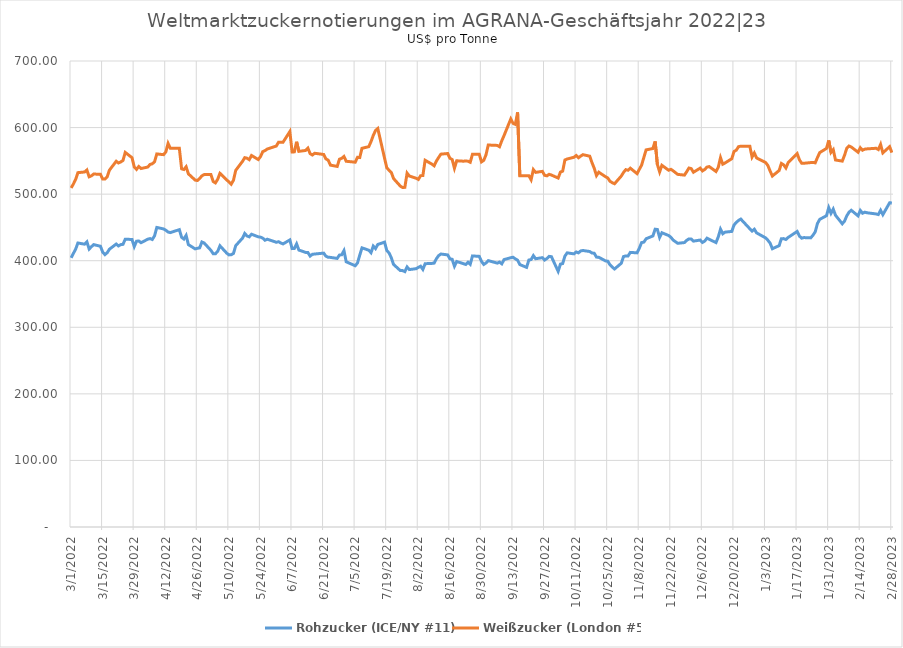
| Category |  Rohzucker (ICE/NY #11)  |  Weißzucker (London #5)  |
|---|---|---|
| 3/1/22 | 404.328 | 509.3 |
| 3/2/22 | 410.942 | 515.2 |
| 3/3/22 | 417.335 | 522.2 |
| 3/4/22 | 426.595 | 532.3 |
| 3/7/22 | 424.831 | 533.3 |
| 3/8/22 | 428.358 | 536.3 |
| 3/9/22 | 417.556 | 526.1 |
| 3/10/22 | 421.083 | 527.5 |
| 3/11/22 | 424.17 | 530.2 |
| 3/14/22 | 421.745 | 529.8 |
| 3/15/22 | 412.926 | 522.7 |
| 3/16/22 | 409.178 | 522.6 |
| 3/17/22 | 412.044 | 526 |
| 3/18/22 | 417.335 | 536.1 |
| 3/21/22 | 425.052 | 549.4 |
| 3/22/22 | 422.186 | 546.8 |
| 3/23/22 | 424.17 | 548.4 |
| 3/24/22 | 424.611 | 550.6 |
| 3/25/22 | 432.327 | 562.7 |
| 3/28/22 | 431.886 | 554.8 |
| 3/29/22 | 421.304 | 540.8 |
| 3/30/22 | 429.24 | 537.2 |
| 3/31/22 | 429.681 | 541.5 |
| 4/1/22 | 427.036 | 538.5 |
| 4/4/22 | 432.327 | 540.7 |
| 4/5/22 | 433.209 | 544.6 |
| 4/6/22 | 431.886 | 545.6 |
| 4/7/22 | 437.397 | 548.7 |
| 4/8/22 | 449.964 | 560.4 |
| 4/11/22 | 447.759 | 559.3 |
| 4/12/22 | 445.775 | 563.4 |
| 4/13/22 | 443.129 | 576.2 |
| 4/14/22 | 442.248 | 568.8 |
| 4/18/22 | 446.657 | 568.8 |
| 4/19/22 | 435.193 | 538 |
| 4/20/22 | 432.547 | 537 |
| 4/21/22 | 438.059 | 541.1 |
| 4/22/22 | 424.17 | 530.5 |
| 4/25/22 | 417.776 | 521.1 |
| 4/26/22 | 418.658 | 520.5 |
| 4/27/22 | 419.319 | 523.5 |
| 4/28/22 | 428.138 | 527.5 |
| 4/29/22 | 426.595 | 529.4 |
| 5/2/22 | 415.572 | 529.4 |
| 5/3/22 | 410.501 | 519 |
| 5/4/22 | 410.501 | 516.9 |
| 5/5/22 | 414.028 | 522.3 |
| 5/6/22 | 422.406 | 531.3 |
| 5/9/22 | 411.383 | 521.4 |
| 5/10/22 | 408.737 | 518.3 |
| 5/11/22 | 408.958 | 515 |
| 5/12/22 | 410.942 | 520.9 |
| 5/13/22 | 422.626 | 535.7 |
| 5/16/22 | 433.87 | 549.2 |
| 5/17/22 | 440.925 | 554.8 |
| 5/18/22 | 437.177 | 554 |
| 5/19/22 | 435.854 | 551.8 |
| 5/20/22 | 439.822 | 558.1 |
| 5/23/22 | 435.854 | 552 |
| 5/24/22 | 435.413 | 556.5 |
| 5/25/22 | 433.87 | 563.9 |
| 5/26/22 | 430.784 | 565.4 |
| 5/27/22 | 432.327 | 567.8 |
| 5/31/22 | 427.697 | 572.3 |
| 6/1/22 | 428.579 | 578.1 |
| 6/2/22 | 426.595 | 578.1 |
| 6/3/22 | 425.272 | 578.1 |
| 6/6/22 | 431.224 | 594 |
| 6/7/22 | 418.217 | 563.4 |
| 6/8/22 | 418.438 | 563.5 |
| 6/9/22 | 425.272 | 578.7 |
| 6/10/22 | 416.013 | 564.3 |
| 6/13/22 | 412.485 | 565.6 |
| 6/14/22 | 412.265 | 569.1 |
| 6/15/22 | 406.974 | 560.8 |
| 6/16/22 | 409.619 | 558.8 |
| 6/17/22 | 410.06 | 561.4 |
| 6/21/22 | 411.383 | 559.6 |
| 6/22/22 | 406.753 | 553 |
| 6/23/22 | 405.21 | 551 |
| 6/24/22 | 404.989 | 543.6 |
| 6/27/22 | 403.446 | 541.6 |
| 6/28/22 | 408.517 | 552.5 |
| 6/29/22 | 408.958 | 553.8 |
| 6/30/22 | 415.131 | 556.6 |
| 7/1/22 | 398.376 | 549.4 |
| 7/5/22 | 392.423 | 548 |
| 7/6/22 | 396.612 | 555.3 |
| 7/7/22 | 408.296 | 555 |
| 7/8/22 | 419.319 | 568.9 |
| 7/11/22 | 415.792 | 571.3 |
| 7/12/22 | 412.044 | 578.9 |
| 7/13/22 | 421.965 | 588.2 |
| 7/14/22 | 418.217 | 595.6 |
| 7/15/22 | 424.39 | 598.6 |
| 7/18/22 | 427.918 | 554.1 |
| 7/19/22 | 415.351 | 539.6 |
| 7/20/22 | 411.603 | 535.9 |
| 7/21/22 | 404.549 | 532.6 |
| 7/22/22 | 394.407 | 523.4 |
| 7/25/22 | 385.148 | 512.1 |
| 7/26/22 | 385.148 | 510 |
| 7/27/22 | 383.605 | 510.2 |
| 7/28/22 | 390.659 | 531.6 |
| 7/29/22 | 386.691 | 527.2 |
| 8/1/22 | 388.014 | 523.9 |
| 8/2/22 | 389.998 | 522.1 |
| 8/3/22 | 391.762 | 527.7 |
| 8/4/22 | 386.912 | 528 |
| 8/5/22 | 395.51 | 550.9 |
| 8/8/22 | 395.95 | 545.1 |
| 8/9/22 | 396.391 | 542.6 |
| 8/10/22 | 403.005 | 549.7 |
| 8/11/22 | 407.635 | 555.1 |
| 8/12/22 | 410.06 | 560.1 |
| 8/15/22 | 408.737 | 561 |
| 8/16/22 | 402.785 | 553.9 |
| 8/17/22 | 402.123 | 552 |
| 8/18/22 | 391.762 | 538.9 |
| 8/19/22 | 398.816 | 550.1 |
| 8/22/22 | 395.51 | 549.5 |
| 8/23/22 | 394.407 | 549.8 |
| 8/24/22 | 397.714 | 549.5 |
| 8/25/22 | 394.628 | 547.9 |
| 8/26/22 | 407.194 | 559.9 |
| 8/29/22 | 406.533 | 559.9 |
| 8/30/22 | 399.037 | 548.5 |
| 8/31/22 | 394.407 | 550.8 |
| 9/1/22 | 396.612 | 559.1 |
| 9/2/22 | 400.139 | 573.8 |
| 9/6/22 | 396.391 | 573.2 |
| 9/7/22 | 397.935 | 571.2 |
| 9/8/22 | 395.289 | 580.2 |
| 9/9/22 | 401.682 | 588 |
| 9/12/22 | 404.549 | 613 |
| 9/13/22 | 405.21 | 606.3 |
| 9/14/22 | 402.785 | 604.8 |
| 9/15/22 | 400.801 | 622.8 |
| 9/16/22 | 394.187 | 527.8 |
| 9/19/22 | 389.998 | 527.8 |
| 9/20/22 | 401.021 | 527.7 |
| 9/21/22 | 401.682 | 521.6 |
| 9/22/22 | 407.635 | 536.9 |
| 9/23/22 | 403.005 | 532.7 |
| 9/26/22 | 404.549 | 534.2 |
| 9/27/22 | 401.021 | 528.3 |
| 9/28/22 | 403.226 | 527.5 |
| 9/29/22 | 406.533 | 529.8 |
| 9/30/22 | 406.092 | 528.7 |
| 10/3/22 | 384.046 | 524.2 |
| 10/4/22 | 394.848 | 533.1 |
| 10/5/22 | 395.73 | 534.6 |
| 10/6/22 | 406.974 | 551.3 |
| 10/7/22 | 411.824 | 552.8 |
| 10/10/22 | 410.281 | 555.4 |
| 10/11/22 | 413.147 | 558 |
| 10/12/22 | 411.824 | 554.6 |
| 10/13/22 | 414.69 | 557.2 |
| 10/14/22 | 415.351 | 559.3 |
| 10/17/22 | 413.808 | 557 |
| 10/18/22 | 411.603 | 547.3 |
| 10/19/22 | 411.162 | 538.8 |
| 10/20/22 | 405.43 | 527.9 |
| 10/21/22 | 405.21 | 533 |
| 10/24/22 | 399.698 | 526.2 |
| 10/25/22 | 399.257 | 524.3 |
| 10/26/22 | 393.746 | 519.3 |
| 10/27/22 | 390.439 | 517.2 |
| 10/28/22 | 387.573 | 515.6 |
| 10/31/22 | 396.171 | 527.2 |
| 11/1/22 | 406.312 | 532.7 |
| 11/2/22 | 407.194 | 536.8 |
| 11/3/22 | 407.194 | 535.9 |
| 11/4/22 | 412.485 | 539 |
| 11/7/22 | 411.824 | 530.8 |
| 11/8/22 | 418.879 | 537.3 |
| 11/9/22 | 427.256 | 543.5 |
| 11/10/22 | 427.918 | 555.1 |
| 11/11/22 | 432.988 | 566.5 |
| 11/14/22 | 437.177 | 568.5 |
| 11/15/22 | 447.318 | 579.2 |
| 11/16/22 | 446.877 | 544.6 |
| 11/17/22 | 434.972 | 533.4 |
| 11/18/22 | 442.027 | 543.3 |
| 11/21/22 | 437.838 | 535.9 |
| 11/22/22 | 435.193 | 537.3 |
| 11/23/22 | 431.004 | 535 |
| 11/25/22 | 426.154 | 529.7 |
| 11/28/22 | 427.256 | 528.6 |
| 11/29/22 | 430.563 | 533.7 |
| 11/30/22 | 432.768 | 539.2 |
| 12/1/22 | 432.547 | 538.4 |
| 12/2/22 | 429.461 | 532.9 |
| 12/5/22 | 431.004 | 539.1 |
| 12/6/22 | 427.477 | 534.9 |
| 12/7/22 | 429.461 | 537.1 |
| 12/8/22 | 433.87 | 540.6 |
| 12/9/22 | 432.106 | 541.4 |
| 12/12/22 | 427.256 | 534 |
| 12/13/22 | 435.634 | 540.3 |
| 12/14/22 | 447.318 | 554.8 |
| 12/15/22 | 440.484 | 545 |
| 12/16/22 | 442.909 | 546.8 |
| 12/19/22 | 444.011 | 553.2 |
| 12/20/22 | 453.712 | 564.1 |
| 12/21/22 | 457.459 | 566.1 |
| 12/22/22 | 460.546 | 571.3 |
| 12/23/22 | 462.53 | 572.1 |
| 12/27/22 | 447.98 | 572.1 |
| 12/28/22 | 444.452 | 555.7 |
| 12/29/22 | 447.318 | 561.8 |
| 12/30/22 | 441.807 | 554.4 |
| 1/3/23 | 434.311 | 547.5 |
| 1/4/23 | 430.784 | 543.1 |
| 1/5/23 | 426.374 | 534.7 |
| 1/6/23 | 417.997 | 527.2 |
| 1/9/23 | 422.626 | 535.5 |
| 1/10/23 | 432.988 | 546.1 |
| 1/11/23 | 433.209 | 544 |
| 1/12/23 | 431.886 | 539.3 |
| 1/13/23 | 434.972 | 547.3 |
| 1/17/23 | 444.011 | 560.9 |
| 1/18/23 | 436.956 | 551.6 |
| 1/19/23 | 433.87 | 546.5 |
| 1/20/23 | 434.752 | 546.4 |
| 1/23/23 | 434.311 | 547.4 |
| 1/24/23 | 438.279 | 547.7 |
| 1/25/23 | 443.35 | 547 |
| 1/26/23 | 455.916 | 555 |
| 1/27/23 | 462.089 | 562.4 |
| 1/30/23 | 467.601 | 568.7 |
| 1/31/23 | 479.726 | 580.7 |
| 2/1/23 | 471.128 | 562.7 |
| 2/2/23 | 477.522 | 566.8 |
| 2/3/23 | 468.262 | 551.3 |
| 2/6/23 | 455.475 | 549.6 |
| 2/7/23 | 459.444 | 558.4 |
| 2/8/23 | 467.38 | 568.9 |
| 2/9/23 | 472.892 | 572.3 |
| 2/10/23 | 475.758 | 570.8 |
| 2/13/23 | 467.38 | 563 |
| 2/14/23 | 475.537 | 569.7 |
| 2/15/23 | 471.349 | 566 |
| 2/16/23 | 472.892 | 567.6 |
| 2/17/23 | 472.01 | 568 |
| 2/21/23 | 470.246 | 568.9 |
| 2/22/23 | 469.364 | 567 |
| 2/23/23 | 475.758 | 574.7 |
| 2/24/23 | 469.144 | 562 |
| 2/27/23 | 487.001 | 571.3 |
| 2/28/23 | 486.781 | 562.4 |